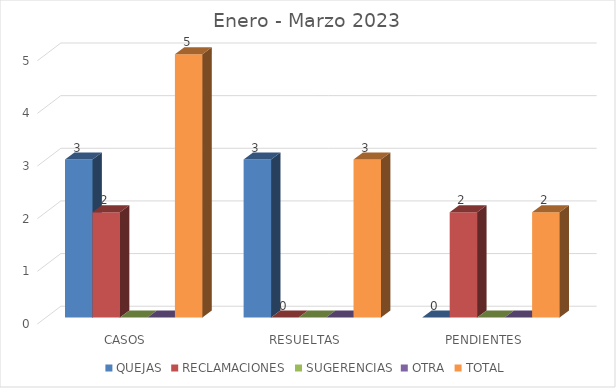
| Category | QUEJAS | RECLAMACIONES | SUGERENCIAS | OTRA | TOTAL |
|---|---|---|---|---|---|
| CASOS | 3 | 2 | 0 | 0 | 5 |
| RESUELTAS | 3 | 0 | 0 | 0 | 3 |
| PENDIENTES | 0 | 2 | 0 | 0 | 2 |